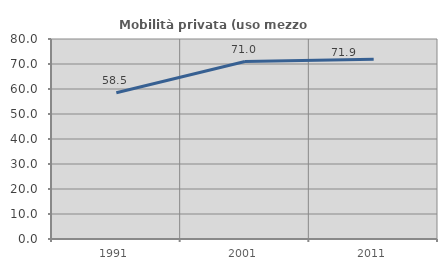
| Category | Mobilità privata (uso mezzo privato) |
|---|---|
| 1991.0 | 58.5 |
| 2001.0 | 70.991 |
| 2011.0 | 71.863 |